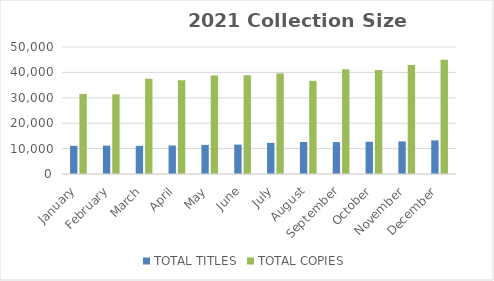
| Category | TOTAL TITLES | TOTAL COPIES |
|---|---|---|
| January | 11088 | 31530 |
| February | 11160 | 31364 |
| March | 11079 | 37488 |
| April | 11216 | 36881 |
| May | 11455 | 38791 |
| June | 11573 | 38877 |
| July | 12248 | 39605 |
| August | 12597 | 36690 |
| September | 12546 | 41204 |
| October | 12689 | 40955 |
| November | 12808 | 42919 |
| December | 13237 | 44994 |